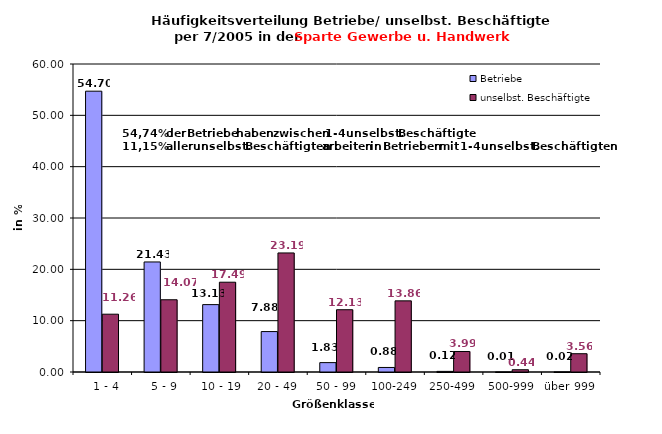
| Category | Betriebe | unselbst. Beschäftigte |
|---|---|---|
|   1 - 4 | 54.705 | 11.259 |
|   5 - 9 | 21.435 | 14.072 |
|  10 - 19 | 13.126 | 17.491 |
| 20 - 49 | 7.876 | 23.191 |
| 50 - 99 | 1.828 | 12.132 |
| 100-249 | 0.884 | 13.856 |
| 250-499 | 0.121 | 3.994 |
| 500-999 | 0.009 | 0.44 |
| über 999 | 0.017 | 3.563 |